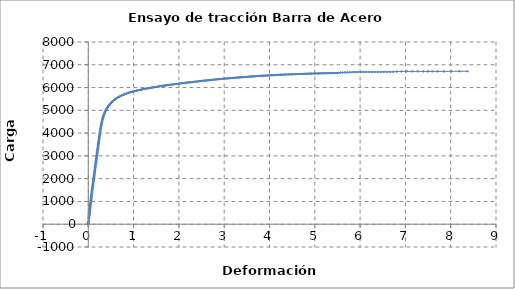
| Category | Series 0 |
|---|---|
| -0.0001 | -0.173 |
| 0.0 | -0.055 |
| 0.0 | 0.21 |
| 0.0001 | 0.314 |
| -0.001 | 0.575 |
| -0.0051 | 0.909 |
| -0.005 | 1.136 |
| -0.0016 | 1.019 |
| -0.0012 | -0.718 |
| -0.0012 | 3.583 |
| -0.0011 | 16.106 |
| -0.0002 | 33.98 |
| 0.0016 | 58.416 |
| 0.0034 | 83.53 |
| 0.0043 | 98.206 |
| 0.0058 | 124.454 |
| 0.0083 | 177.635 |
| 0.0111 | 238.674 |
| 0.0133 | 284.641 |
| 0.0148 | 319.02 |
| 0.0165 | 352.838 |
| 0.018 | 384.089 |
| 0.0189 | 410.98 |
| 0.0197 | 432.396 |
| 0.0207 | 452.271 |
| 0.0217 | 471.771 |
| 0.0225 | 491.747 |
| 0.0233 | 511.806 |
| 0.0243 | 532.473 |
| 0.0256 | 554.774 |
| 0.027 | 578.026 |
| 0.0287 | 602.163 |
| 0.0304 | 626.245 |
| 0.0321 | 650.324 |
| 0.0339 | 675.029 |
| 0.0357 | 700.258 |
| 0.0376 | 726.9 |
| 0.0394 | 753.241 |
| 0.0412 | 780.706 |
| 0.043 | 808.204 |
| 0.0447 | 837.192 |
| 0.0464 | 866.009 |
| 0.0482 | 895.987 |
| 0.05 | 926.06 |
| 0.0519 | 954.846 |
| 0.0538 | 984.559 |
| 0.0557 | 1015.82 |
| 0.0576 | 1047.465 |
| 0.0596 | 1079.516 |
| 0.0616 | 1112.497 |
| 0.0636 | 1144.403 |
| 0.0657 | 1176.682 |
| 0.0677 | 1208.724 |
| 0.0698 | 1242.482 |
| 0.0719 | 1276.066 |
| 0.074 | 1309.114 |
| 0.0761 | 1343.989 |
| 0.0782 | 1378.826 |
| 0.0804 | 1414.842 |
| 0.0827 | 1450.36 |
| 0.0851 | 1485.648 |
| 0.0875 | 1521.894 |
| 0.0898 | 1557.157 |
| 0.0921 | 1592.698 |
| 0.0943 | 1628.518 |
| 0.0968 | 1664.52 |
| 0.0994 | 1701.781 |
| 0.1018 | 1738.003 |
| 0.1043 | 1774.724 |
| 0.1067 | 1811.585 |
| 0.1091 | 1847.498 |
| 0.1114 | 1883.888 |
| 0.1138 | 1919.184 |
| 0.1161 | 1953.368 |
| 0.1184 | 1988.416 |
| 0.1207 | 2023.386 |
| 0.1231 | 2059.473 |
| 0.1256 | 2094.249 |
| 0.1279 | 2129.598 |
| 0.1303 | 2165.181 |
| 0.1327 | 2200.319 |
| 0.135 | 2236.493 |
| 0.1373 | 2272.549 |
| 0.1396 | 2309.799 |
| 0.142 | 2346.653 |
| 0.1446 | 2384.545 |
| 0.1471 | 2421.368 |
| 0.1496 | 2459.412 |
| 0.1521 | 2496.607 |
| 0.1546 | 2534.22 |
| 0.1572 | 2570.984 |
| 0.1597 | 2608.263 |
| 0.1623 | 2644.74 |
| 0.1649 | 2680.209 |
| 0.1673 | 2716.616 |
| 0.1697 | 2752.033 |
| 0.1721 | 2787.378 |
| 0.1744 | 2821.058 |
| 0.1768 | 2855.41 |
| 0.1791 | 2889.71 |
| 0.1814 | 2923.07 |
| 0.1838 | 2957.757 |
| 0.1861 | 2991.868 |
| 0.1883 | 3025.77 |
| 0.1905 | 3059.124 |
| 0.1928 | 3091.895 |
| 0.1952 | 3125.782 |
| 0.1976 | 3159.666 |
| 0.2 | 3194.379 |
| 0.2022 | 3227.451 |
| 0.2045 | 3261.464 |
| 0.2067 | 3295.192 |
| 0.2089 | 3328.759 |
| 0.2112 | 3362.404 |
| 0.2136 | 3395.943 |
| 0.2161 | 3429.4 |
| 0.2185 | 3463.996 |
| 0.2208 | 3498.009 |
| 0.2231 | 3532.871 |
| 0.2256 | 3567.81 |
| 0.228 | 3602.14 |
| 0.2306 | 3637.368 |
| 0.2332 | 3673.087 |
| 0.2357 | 3708.785 |
| 0.2383 | 3745.712 |
| 0.2407 | 3781.869 |
| 0.2433 | 3818.697 |
| 0.2458 | 3855.673 |
| 0.2484 | 3892.804 |
| 0.2511 | 3929.486 |
| 0.2539 | 3966.88 |
| 0.2566 | 4004.802 |
| 0.2595 | 4042.089 |
| 0.2624 | 4080.16 |
| 0.2653 | 4117.255 |
| 0.2683 | 4154.864 |
| 0.2713 | 4191.721 |
| 0.2745 | 4229.333 |
| 0.2778 | 4266.244 |
| 0.2813 | 4304.333 |
| 0.2848 | 4341.506 |
| 0.2884 | 4380.05 |
| 0.2922 | 4417.996 |
| 0.2962 | 4456.543 |
| 0.3004 | 4495.63 |
| 0.3047 | 4533.965 |
| 0.3094 | 4572.656 |
| 0.3143 | 4610.285 |
| 0.3195 | 4648.12 |
| 0.3249 | 4685.569 |
| 0.3304 | 4722.079 |
| 0.3365 | 4759.05 |
| 0.3428 | 4794.679 |
| 0.3496 | 4831.141 |
| 0.3566 | 4867.138 |
| 0.3641 | 4903.764 |
| 0.3719 | 4939.311 |
| 0.3806 | 4975.12 |
| 0.3897 | 5009.487 |
| 0.3991 | 5043.519 |
| 0.4086 | 5076.608 |
| 0.4188 | 5110.439 |
| 0.4292 | 5142.361 |
| 0.4401 | 5173.407 |
| 0.4512 | 5203.422 |
| 0.4628 | 5234.063 |
| 0.4747 | 5263.814 |
| 0.4873 | 5293.902 |
| 0.5004 | 5322.999 |
| 0.5137 | 5350.455 |
| 0.5277 | 5377.738 |
| 0.5418 | 5403.934 |
| 0.5566 | 5430.124 |
| 0.5716 | 5454.162 |
| 0.5874 | 5478.344 |
| 0.6035 | 5502.064 |
| 0.6203 | 5525.441 |
| 0.6372 | 5547.228 |
| 0.655 | 5568.714 |
| 0.6733 | 5589.264 |
| 0.6916 | 5608.904 |
| 0.7108 | 5628.384 |
| 0.7299 | 5646.518 |
| 0.7499 | 5664.63 |
| 0.7699 | 5681.872 |
| 0.7907 | 5698.76 |
| 0.8118 | 5715.302 |
| 0.8328 | 5731.226 |
| 0.8545 | 5747.077 |
| 0.8762 | 5761.489 |
| 0.8983 | 5775.499 |
| 0.9202 | 5789.291 |
| 0.9428 | 5802.764 |
| 0.9652 | 5815.011 |
| 0.9883 | 5827.012 |
| 1.0111 | 5838.798 |
| 1.0346 | 5850.394 |
| 1.0576 | 5861.537 |
| 1.0812 | 5872.422 |
| 1.1044 | 5883.087 |
| 1.1282 | 5893.738 |
| 1.1514 | 5903.932 |
| 1.1742 | 5914.164 |
| 1.1987 | 5924.453 |
| 1.2233 | 5933.447 |
| 1.2484 | 5942.821 |
| 1.2727 | 5952.193 |
| 1.2974 | 5960.762 |
| 1.3217 | 5969.257 |
| 1.3466 | 5978.495 |
| 1.3711 | 5987.169 |
| 1.396 | 5995.907 |
| 1.4206 | 6003.585 |
| 1.4457 | 6012.258 |
| 1.4709 | 6020.81 |
| 1.4956 | 6028.204 |
| 1.5208 | 6036.777 |
| 1.546 | 6045.368 |
| 1.5708 | 6052.952 |
| 1.5962 | 6061.299 |
| 1.6212 | 6069.54 |
| 1.6468 | 6077.223 |
| 1.6719 | 6084.689 |
| 1.6976 | 6092.22 |
| 1.7233 | 6099.065 |
| 1.7485 | 6106.025 |
| 1.7744 | 6113.8 |
| 1.8 | 6120.58 |
| 1.8264 | 6127.134 |
| 1.8525 | 6134.282 |
| 1.8793 | 6141.559 |
| 1.906 | 6148.504 |
| 1.9321 | 6155.12 |
| 1.9589 | 6162.085 |
| 1.9852 | 6169.061 |
| 2.0118 | 6175.536 |
| 2.0384 | 6181.937 |
| 2.0643 | 6188.484 |
| 2.0906 | 6195.09 |
| 2.1162 | 6201.223 |
| 2.1423 | 6207.002 |
| 2.1679 | 6213.099 |
| 2.1941 | 6219.917 |
| 2.2203 | 6225.915 |
| 2.2475 | 6231.694 |
| 2.2746 | 6238.031 |
| 2.3013 | 6244.26 |
| 2.3286 | 6250.477 |
| 2.355 | 6256.633 |
| 2.3817 | 6262.735 |
| 2.4075 | 6268.53 |
| 2.4339 | 6273.637 |
| 2.4603 | 6278.976 |
| 2.4861 | 6285.504 |
| 2.5126 | 6292.428 |
| 2.5387 | 6298.261 |
| 2.5654 | 6303.985 |
| 2.5921 | 6309.861 |
| 2.6186 | 6315.788 |
| 2.6447 | 6321.056 |
| 2.6717 | 6326.141 |
| 2.698 | 6331.68 |
| 2.7249 | 6337.57 |
| 2.751 | 6342.528 |
| 2.7776 | 6347.572 |
| 2.8036 | 6353.136 |
| 2.8301 | 6358.261 |
| 2.8561 | 6363.079 |
| 2.8829 | 6368.466 |
| 2.9099 | 6373.41 |
| 2.9361 | 6378.364 |
| 2.9629 | 6383.48 |
| 2.9898 | 6388.53 |
| 3.0163 | 6393.116 |
| 3.0433 | 6397.643 |
| 3.0702 | 6402.143 |
| 3.0972 | 6406.341 |
| 3.1235 | 6410.572 |
| 3.1501 | 6415.186 |
| 3.1767 | 6419.9 |
| 3.2028 | 6424.239 |
| 3.2295 | 6428.759 |
| 3.2556 | 6433.774 |
| 3.2824 | 6438.361 |
| 3.3091 | 6442.441 |
| 3.3353 | 6445.961 |
| 3.3622 | 6449.575 |
| 3.3894 | 6453.399 |
| 3.4161 | 6457.628 |
| 3.4434 | 6462.126 |
| 3.47 | 6466.392 |
| 3.4965 | 6470.431 |
| 3.523 | 6474.468 |
| 3.5496 | 6478.599 |
| 3.5767 | 6482.516 |
| 3.6032 | 6485.954 |
| 3.6297 | 6489.476 |
| 3.6566 | 6493.507 |
| 3.6838 | 6497.733 |
| 3.7112 | 6501.752 |
| 3.7384 | 6505.495 |
| 3.7657 | 6509.245 |
| 3.793 | 6512.445 |
| 3.8198 | 6515.337 |
| 3.8466 | 6518.514 |
| 3.8743 | 6521.552 |
| 3.902 | 6524.976 |
| 3.9295 | 6529.07 |
| 3.9567 | 6533.042 |
| 3.9842 | 6536.486 |
| 4.0127 | 6539.219 |
| 4.0412 | 6541.492 |
| 4.07 | 6544.006 |
| 4.0987 | 6546.831 |
| 4.1268 | 6549.438 |
| 4.1549 | 6552.769 |
| 4.1835 | 6555.75 |
| 4.2115 | 6558.398 |
| 4.2396 | 6561.048 |
| 4.2683 | 6563.537 |
| 4.2974 | 6565.911 |
| 4.327 | 6568.575 |
| 4.3565 | 6571.065 |
| 4.3872 | 6573.406 |
| 4.4195 | 6576.205 |
| 4.4524 | 6579.13 |
| 4.4844 | 6581.682 |
| 4.5149 | 6584.125 |
| 4.545 | 6586.613 |
| 4.5749 | 6589.001 |
| 4.6047 | 6591.017 |
| 4.634 | 6592.538 |
| 4.6634 | 6594.023 |
| 4.6933 | 6595.903 |
| 4.7225 | 6597.968 |
| 4.7517 | 6600.264 |
| 4.7817 | 6602.579 |
| 4.8111 | 6604.919 |
| 4.8409 | 6607.28 |
| 4.8708 | 6609.615 |
| 4.9011 | 6611.735 |
| 4.9317 | 6613.441 |
| 4.9623 | 6614.975 |
| 4.9925 | 6616.989 |
| 5.0224 | 6618.818 |
| 5.0528 | 6620.166 |
| 5.0841 | 6622.03 |
| 5.1146 | 6624.076 |
| 5.145 | 6625.652 |
| 5.1764 | 6627.424 |
| 5.2071 | 6629.08 |
| 5.2381 | 6630.562 |
| 5.27 | 6631.915 |
| 5.3019 | 6632.977 |
| 5.3332 | 6634.106 |
| 5.3646 | 6635.53 |
| 5.3966 | 6636.494 |
| 5.428 | 6637.647 |
| 5.4595 | 6638.736 |
| 5.4919 | 6639.891 |
| 5.5262 | 6645.263 |
| 5.5651 | 6652.898 |
| 5.6111 | 6660.082 |
| 5.6624 | 6665.114 |
| 5.7167 | 6667.59 |
| 5.775 | 6671.97 |
| 5.8329 | 6676.896 |
| 5.8864 | 6681.168 |
| 5.9454 | 6683.932 |
| 6.0119 | 6684.532 |
| 6.0753 | 6684.569 |
| 6.139 | 6684.438 |
| 6.2029 | 6684.253 |
| 6.2669 | 6684.492 |
| 6.3308 | 6684.78 |
| 6.3948 | 6685.213 |
| 6.4585 | 6686.028 |
| 6.5238 | 6686.538 |
| 6.5913 | 6687.189 |
| 6.6581 | 6687.759 |
| 6.7291 | 6691.127 |
| 6.8109 | 6699.967 |
| 6.9125 | 6708.942 |
| 7.0292 | 6710.939 |
| 7.1501 | 6709.589 |
| 7.2725 | 6709.224 |
| 7.396 | 6709.254 |
| 7.498 | 6709.26 |
| 7.5905 | 6709.199 |
| 7.7103 | 6709.619 |
| 7.8543 | 6710.164 |
| 8.012 | 6712.291 |
| 8.1911 | 6714.511 |
| 8.3694 | 6715.04 |